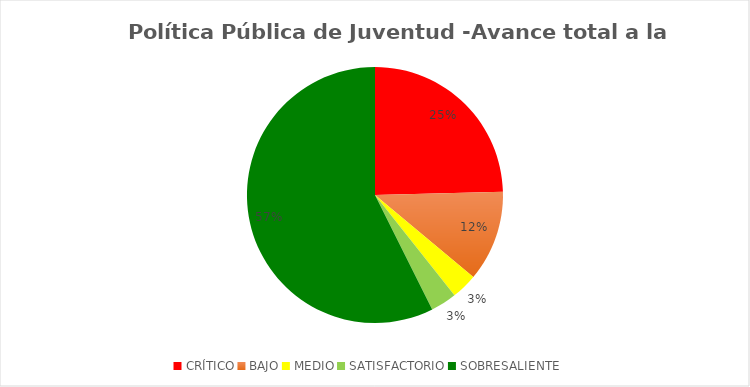
| Category | Series 0 |
|---|---|
| CRÍTICO | 15 |
| BAJO | 7 |
| MEDIO | 2 |
| SATISFACTORIO | 2 |
| SOBRESALIENTE | 35 |